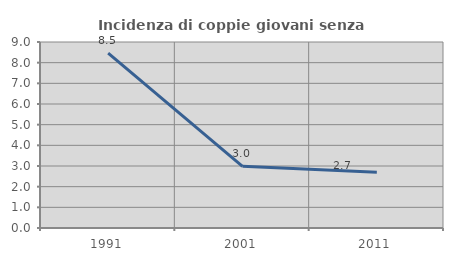
| Category | Incidenza di coppie giovani senza figli |
|---|---|
| 1991.0 | 8.466 |
| 2001.0 | 2.985 |
| 2011.0 | 2.703 |